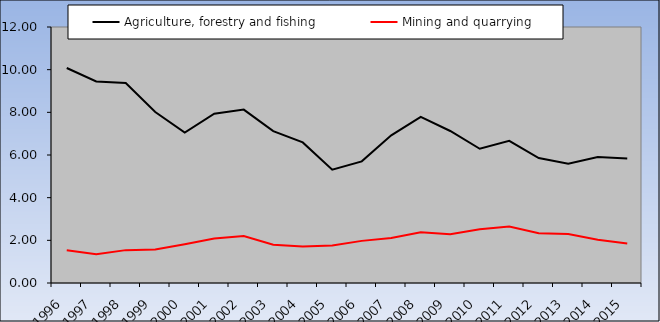
| Category | Agriculture, forestry and fishing | Mining and quarrying |
|---|---|---|
| 1996.0 | 10.077 | 1.54 |
| 1997.0 | 9.447 | 1.353 |
| 1998.0 | 9.373 | 1.541 |
| 1999.0 | 8.017 | 1.572 |
| 2000.0 | 7.055 | 1.818 |
| 2001.0 | 7.938 | 2.086 |
| 2002.0 | 8.128 | 2.202 |
| 2003.0 | 7.119 | 1.795 |
| 2004.0 | 6.589 | 1.713 |
| 2005.0 | 5.312 | 1.762 |
| 2006.0 | 5.703 | 1.975 |
| 2007.0 | 6.92 | 2.108 |
| 2008.0 | 7.791 | 2.38 |
| 2009.0 | 7.125 | 2.28 |
| 2010.0 | 6.291 | 2.514 |
| 2011.0 | 6.666 | 2.648 |
| 2012.0 | 5.858 | 2.332 |
| 2013.0 | 5.592 | 2.301 |
| 2014.0 | 5.904 | 2.027 |
| 2015.0 | 5.833 | 1.849 |